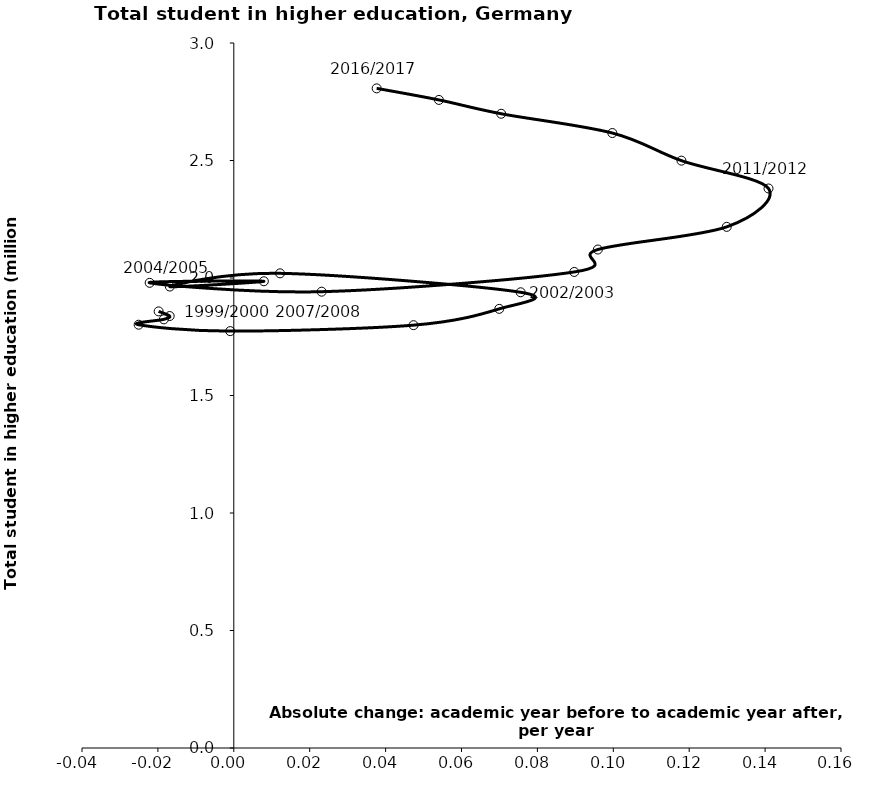
| Category | Series 0 |
|---|---|
| -0.01980700000000013 | 1.858 |
| -0.016899500000000067 | 1.838 |
| -0.018433000000000033 | 1.824 |
| -0.02507550000000003 | 1.801 |
| -0.00094749999999999 | 1.774 |
| 0.047355000000000036 | 1.799 |
| 0.06994750000000005 | 1.869 |
| 0.0755825 | 1.939 |
| 0.012182499999999985 | 2.02 |
| -0.016862500000000002 | 1.964 |
| 0.007923499999999972 | 1.986 |
| -0.02217150000000001 | 1.979 |
| 0.023148500000000127 | 1.942 |
| 0.0897135 | 2.026 |
| 0.09593099999999977 | 2.121 |
| 0.12989200000000012 | 2.218 |
| 0.14090250000000015 | 2.381 |
| 0.11795349999999982 | 2.499 |
| 0.09975049999999985 | 2.617 |
| 0.07045900000000005 | 2.699 |
| 0.054050000000000153 | 2.758 |
| 0.03764100000000026 | 2.807 |